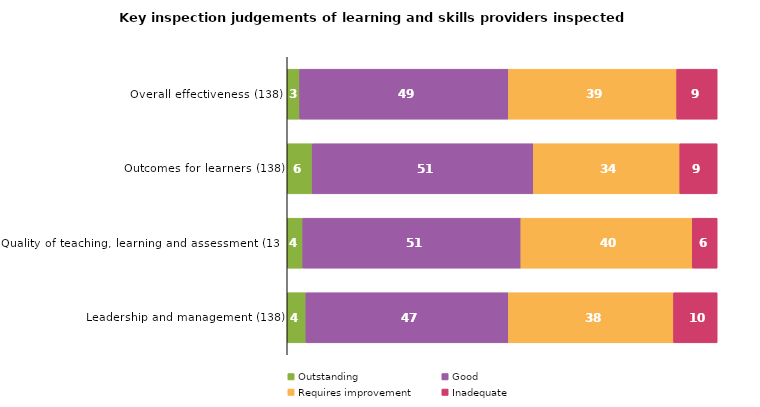
| Category | Outstanding | Good | Requires improvement | Inadequate |
|---|---|---|---|---|
| Overall effectiveness (138) | 2.899 | 48.551 | 39.13 | 9.42 |
| Outcomes for learners (138) | 5.797 | 51.449 | 34.058 | 8.696 |
| Quality of teaching, learning and assessment (138) | 3.623 | 50.725 | 39.855 | 5.797 |
| Leadership and management (138) | 4.348 | 47.101 | 38.406 | 10.145 |